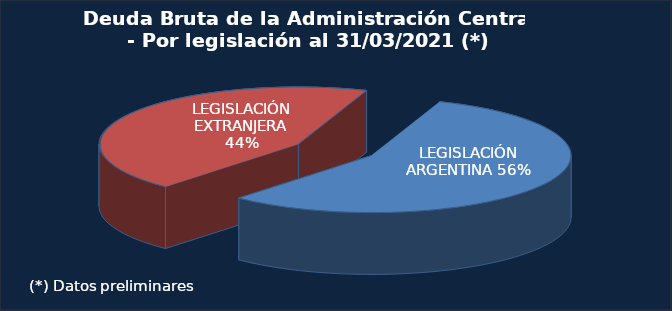
| Category | Series 0 |
|---|---|
| I- LEGISLACIÓN ARGENTINA | 188103.3 |
| II- LEGISLACIÓN EXTRANJERA | 147456.2 |